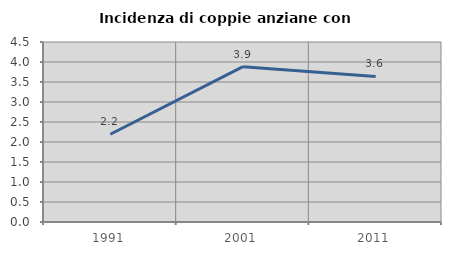
| Category | Incidenza di coppie anziane con figli |
|---|---|
| 1991.0 | 2.194 |
| 2001.0 | 3.883 |
| 2011.0 | 3.639 |